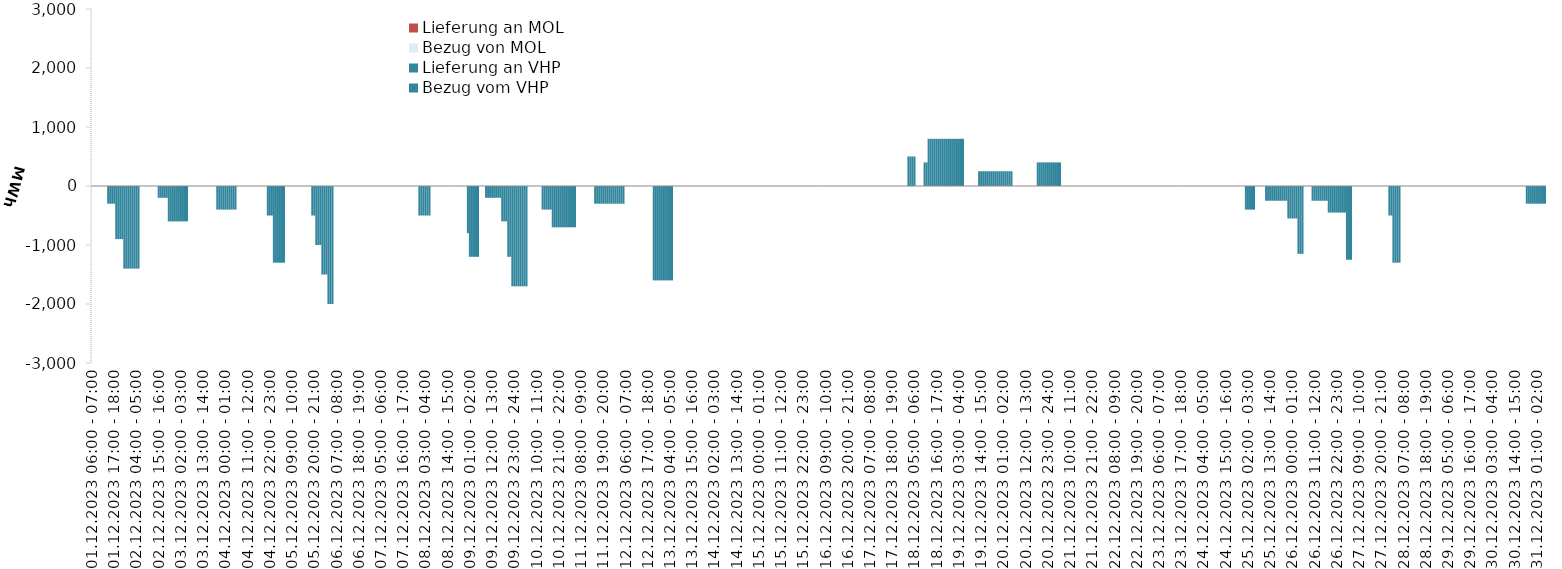
| Category | Bezug vom VHP | Lieferung an VHP | Bezug von MOL | Lieferung an MOL |
|---|---|---|---|---|
| 01.12.2023 06:00 - 07:00 | 0 | 0 | 0 | 0 |
| 01.12.2023 07:00 - 08:00 | 0 | 0 | 0 | 0 |
| 01.12.2023 08:00 - 09:00 | 0 | 0 | 0 | 0 |
| 01.12.2023 09:00 - 10:00 | 0 | 0 | 0 | 0 |
| 01.12.2023 10:00 - 11:00 | 0 | 0 | 0 | 0 |
| 01.12.2023 11:00 - 12:00 | 0 | 0 | 0 | 0 |
| 01.12.2023 12:00 - 13:00 | 0 | 0 | 0 | 0 |
| 01.12.2023 13:00 - 14:00 | 0 | 0 | 0 | 0 |
| 01.12.2023 14:00 - 15:00 | 0 | -300 | 0 | 0 |
| 01.12.2023 15:00 - 16:00 | 0 | -300 | 0 | 0 |
| 01.12.2023 16:00 - 17:00 | 0 | -300 | 0 | 0 |
| 01.12.2023 17:00 - 18:00 | 0 | -300 | 0 | 0 |
| 01.12.2023 18:00 - 19:00 | 0 | -900 | 0 | 0 |
| 01.12.2023 19:00 - 20:00 | 0 | -900 | 0 | 0 |
| 01.12.2023 20:00 - 21:00 | 0 | -900 | 0 | 0 |
| 01.12.2023 21:00 - 22:00 | 0 | -900 | 0 | 0 |
| 01.12.2023 22:00 - 23:00 | 0 | -1400 | 0 | 0 |
| 01.12.2023 23:00 - 24:00 | 0 | -1400 | 0 | 0 |
| 02.12.2023 00:00 - 01:00 | 0 | -1400 | 0 | 0 |
| 02.12.2023 01:00 - 02:00 | 0 | -1400 | 0 | 0 |
| 02.12.2023 02:00 - 03:00 | 0 | -1400 | 0 | 0 |
| 02.12.2023 03:00 - 04:00 | 0 | -1400 | 0 | 0 |
| 02.12.2023 04:00 - 05:00 | 0 | -1400 | 0 | 0 |
| 02.12.2023 05:00 - 06:00 | 0 | -1400 | 0 | 0 |
| 02.12.2023 06:00 - 07:00 | 0 | 0 | 0 | 0 |
| 02.12.2023 07:00 - 08:00 | 0 | 0 | 0 | 0 |
| 02.12.2023 08:00 - 09:00 | 0 | 0 | 0 | 0 |
| 02.12.2023 09:00 - 10:00 | 0 | 0 | 0 | 0 |
| 02.12.2023 10:00 - 11:00 | 0 | 0 | 0 | 0 |
| 02.12.2023 11:00 - 12:00 | 0 | 0 | 0 | 0 |
| 02.12.2023 12:00 - 13:00 | 0 | 0 | 0 | 0 |
| 02.12.2023 13:00 - 14:00 | 0 | 0 | 0 | 0 |
| 02.12.2023 14:00 - 15:00 | 0 | 0 | 0 | 0 |
| 02.12.2023 15:00 - 16:00 | 0 | -200 | 0 | 0 |
| 02.12.2023 16:00 - 17:00 | 0 | -200 | 0 | 0 |
| 02.12.2023 17:00 - 18:00 | 0 | -200 | 0 | 0 |
| 02.12.2023 18:00 - 19:00 | 0 | -200 | 0 | 0 |
| 02.12.2023 19:00 - 20:00 | 0 | -200 | 0 | 0 |
| 02.12.2023 20:00 - 21:00 | 0 | -600 | 0 | 0 |
| 02.12.2023 21:00 - 22:00 | 0 | -600 | 0 | 0 |
| 02.12.2023 22:00 - 23:00 | 0 | -600 | 0 | 0 |
| 02.12.2023 23:00 - 24:00 | 0 | -600 | 0 | 0 |
| 03.12.2023 00:00 - 01:00 | 0 | -600 | 0 | 0 |
| 03.12.2023 01:00 - 02:00 | 0 | -600 | 0 | 0 |
| 03.12.2023 02:00 - 03:00 | 0 | -600 | 0 | 0 |
| 03.12.2023 03:00 - 04:00 | 0 | -600 | 0 | 0 |
| 03.12.2023 04:00 - 05:00 | 0 | -600 | 0 | 0 |
| 03.12.2023 05:00 - 06:00 | 0 | -600 | 0 | 0 |
| 03.12.2023 06:00 - 07:00 | 0 | 0 | 0 | 0 |
| 03.12.2023 07:00 - 08:00 | 0 | 0 | 0 | 0 |
| 03.12.2023 08:00 - 09:00 | 0 | 0 | 0 | 0 |
| 03.12.2023 09:00 - 10:00 | 0 | 0 | 0 | 0 |
| 03.12.2023 10:00 - 11:00 | 0 | 0 | 0 | 0 |
| 03.12.2023 11:00 - 12:00 | 0 | 0 | 0 | 0 |
| 03.12.2023 12:00 - 13:00 | 0 | 0 | 0 | 0 |
| 03.12.2023 13:00 - 14:00 | 0 | 0 | 0 | 0 |
| 03.12.2023 14:00 - 15:00 | 0 | 0 | 0 | 0 |
| 03.12.2023 15:00 - 16:00 | 0 | 0 | 0 | 0 |
| 03.12.2023 16:00 - 17:00 | 0 | 0 | 0 | 0 |
| 03.12.2023 17:00 - 18:00 | 0 | 0 | 0 | 0 |
| 03.12.2023 18:00 - 19:00 | 0 | 0 | 0 | 0 |
| 03.12.2023 19:00 - 20:00 | 0 | 0 | 0 | 0 |
| 03.12.2023 20:00 - 21:00 | 0 | -400 | 0 | 0 |
| 03.12.2023 21:00 - 22:00 | 0 | -400 | 0 | 0 |
| 03.12.2023 22:00 - 23:00 | 0 | -400 | 0 | 0 |
| 03.12.2023 23:00 - 24:00 | 0 | -400 | 0 | 0 |
| 04.12.2023 00:00 - 01:00 | 0 | -400 | 0 | 0 |
| 04.12.2023 01:00 - 02:00 | 0 | -400 | 0 | 0 |
| 04.12.2023 02:00 - 03:00 | 0 | -400 | 0 | 0 |
| 04.12.2023 03:00 - 04:00 | 0 | -400 | 0 | 0 |
| 04.12.2023 04:00 - 05:00 | 0 | -400 | 0 | 0 |
| 04.12.2023 05:00 - 06:00 | 0 | -400 | 0 | 0 |
| 04.12.2023 06:00 - 07:00 | 0 | 0 | 0 | 0 |
| 04.12.2023 07:00 - 08:00 | 0 | 0 | 0 | 0 |
| 04.12.2023 08:00 - 09:00 | 0 | 0 | 0 | 0 |
| 04.12.2023 09:00 - 10:00 | 0 | 0 | 0 | 0 |
| 04.12.2023 10:00 - 11:00 | 0 | 0 | 0 | 0 |
| 04.12.2023 11:00 - 12:00 | 0 | 0 | 0 | 0 |
| 04.12.2023 12:00 - 13:00 | 0 | 0 | 0 | 0 |
| 04.12.2023 13:00 - 14:00 | 0 | 0 | 0 | 0 |
| 04.12.2023 14:00 - 15:00 | 0 | 0 | 0 | 0 |
| 04.12.2023 15:00 - 16:00 | 0 | 0 | 0 | 0 |
| 04.12.2023 16:00 - 17:00 | 0 | 0 | 0 | 0 |
| 04.12.2023 17:00 - 18:00 | 0 | 0 | 0 | 0 |
| 04.12.2023 18:00 - 19:00 | 0 | 0 | 0 | 0 |
| 04.12.2023 19:00 - 20:00 | 0 | 0 | 0 | 0 |
| 04.12.2023 20:00 - 21:00 | 0 | 0 | 0 | 0 |
| 04.12.2023 21:00 - 22:00 | 0 | -500 | 0 | 0 |
| 04.12.2023 22:00 - 23:00 | 0 | -500 | 0 | 0 |
| 04.12.2023 23:00 - 24:00 | 0 | -500 | 0 | 0 |
| 05.12.2023 00:00 - 01:00 | 0 | -1300 | 0 | 0 |
| 05.12.2023 01:00 - 02:00 | 0 | -1300 | 0 | 0 |
| 05.12.2023 02:00 - 03:00 | 0 | -1300 | 0 | 0 |
| 05.12.2023 03:00 - 04:00 | 0 | -1300 | 0 | 0 |
| 05.12.2023 04:00 - 05:00 | 0 | -1300 | 0 | 0 |
| 05.12.2023 05:00 - 06:00 | 0 | -1300 | 0 | 0 |
| 05.12.2023 06:00 - 07:00 | 0 | 0 | 0 | 0 |
| 05.12.2023 07:00 - 08:00 | 0 | 0 | 0 | 0 |
| 05.12.2023 08:00 - 09:00 | 0 | 0 | 0 | 0 |
| 05.12.2023 09:00 - 10:00 | 0 | 0 | 0 | 0 |
| 05.12.2023 10:00 - 11:00 | 0 | 0 | 0 | 0 |
| 05.12.2023 11:00 - 12:00 | 0 | 0 | 0 | 0 |
| 05.12.2023 12:00 - 13:00 | 0 | 0 | 0 | 0 |
| 05.12.2023 13:00 - 14:00 | 0 | 0 | 0 | 0 |
| 05.12.2023 14:00 - 15:00 | 0 | 0 | 0 | 0 |
| 05.12.2023 15:00 - 16:00 | 0 | 0 | 0 | 0 |
| 05.12.2023 16:00 - 17:00 | 0 | 0 | 0 | 0 |
| 05.12.2023 17:00 - 18:00 | 0 | 0 | 0 | 0 |
| 05.12.2023 18:00 - 19:00 | 0 | 0 | 0 | 0 |
| 05.12.2023 19:00 - 20:00 | 0 | -500 | 0 | 0 |
| 05.12.2023 20:00 - 21:00 | 0 | -500 | 0 | 0 |
| 05.12.2023 21:00 - 22:00 | 0 | -1000 | 0 | 0 |
| 05.12.2023 22:00 - 23:00 | 0 | -1000 | 0 | 0 |
| 05.12.2023 23:00 - 24:00 | 0 | -1000 | 0 | 0 |
| 06.12.2023 00:00 - 01:00 | 0 | -1500 | 0 | 0 |
| 06.12.2023 01:00 - 02:00 | 0 | -1500 | 0 | 0 |
| 06.12.2023 02:00 - 03:00 | 0 | -1500 | 0 | 0 |
| 06.12.2023 03:00 - 04:00 | 0 | -2000 | 0 | 0 |
| 06.12.2023 04:00 - 05:00 | 0 | -2000 | 0 | 0 |
| 06.12.2023 05:00 - 06:00 | 0 | -2000 | 0 | 0 |
| 06.12.2023 06:00 - 07:00 | 0 | 0 | 0 | 0 |
| 06.12.2023 07:00 - 08:00 | 0 | 0 | 0 | 0 |
| 06.12.2023 08:00 - 09:00 | 0 | 0 | 0 | 0 |
| 06.12.2023 09:00 - 10:00 | 0 | 0 | 0 | 0 |
| 06.12.2023 10:00 - 11:00 | 0 | 0 | 0 | 0 |
| 06.12.2023 11:00 - 12:00 | 0 | 0 | 0 | 0 |
| 06.12.2023 12:00 - 13:00 | 0 | 0 | 0 | 0 |
| 06.12.2023 13:00 - 14:00 | 0 | 0 | 0 | 0 |
| 06.12.2023 14:00 - 15:00 | 0 | 0 | 0 | 0 |
| 06.12.2023 15:00 - 16:00 | 0 | 0 | 0 | 0 |
| 06.12.2023 16:00 - 17:00 | 0 | 0 | 0 | 0 |
| 06.12.2023 17:00 - 18:00 | 0 | 0 | 0 | 0 |
| 06.12.2023 18:00 - 19:00 | 0 | 0 | 0 | 0 |
| 06.12.2023 19:00 - 20:00 | 0 | 0 | 0 | 0 |
| 06.12.2023 20:00 - 21:00 | 0 | 0 | 0 | 0 |
| 06.12.2023 21:00 - 22:00 | 0 | 0 | 0 | 0 |
| 06.12.2023 22:00 - 23:00 | 0 | 0 | 0 | 0 |
| 06.12.2023 23:00 - 24:00 | 0 | 0 | 0 | 0 |
| 07.12.2023 00:00 - 01:00 | 0 | 0 | 0 | 0 |
| 07.12.2023 01:00 - 02:00 | 0 | 0 | 0 | 0 |
| 07.12.2023 02:00 - 03:00 | 0 | 0 | 0 | 0 |
| 07.12.2023 03:00 - 04:00 | 0 | 0 | 0 | 0 |
| 07.12.2023 04:00 - 05:00 | 0 | 0 | 0 | 0 |
| 07.12.2023 05:00 - 06:00 | 0 | 0 | 0 | 0 |
| 07.12.2023 06:00 - 07:00 | 0 | 0 | 0 | 0 |
| 07.12.2023 07:00 - 08:00 | 0 | 0 | 0 | 0 |
| 07.12.2023 08:00 - 09:00 | 0 | 0 | 0 | 0 |
| 07.12.2023 09:00 - 10:00 | 0 | 0 | 0 | 0 |
| 07.12.2023 10:00 - 11:00 | 0 | 0 | 0 | 0 |
| 07.12.2023 11:00 - 12:00 | 0 | 0 | 0 | 0 |
| 07.12.2023 12:00 - 13:00 | 0 | 0 | 0 | 0 |
| 07.12.2023 13:00 - 14:00 | 0 | 0 | 0 | 0 |
| 07.12.2023 14:00 - 15:00 | 0 | 0 | 0 | 0 |
| 07.12.2023 15:00 - 16:00 | 0 | 0 | 0 | 0 |
| 07.12.2023 16:00 - 17:00 | 0 | 0 | 0 | 0 |
| 07.12.2023 17:00 - 18:00 | 0 | 0 | 0 | 0 |
| 07.12.2023 18:00 - 19:00 | 0 | 0 | 0 | 0 |
| 07.12.2023 19:00 - 20:00 | 0 | 0 | 0 | 0 |
| 07.12.2023 20:00 - 21:00 | 0 | 0 | 0 | 0 |
| 07.12.2023 21:00 - 22:00 | 0 | 0 | 0 | 0 |
| 07.12.2023 22:00 - 23:00 | 0 | 0 | 0 | 0 |
| 07.12.2023 23:00 - 24:00 | 0 | 0 | 0 | 0 |
| 08.12.2023 00:00 - 01:00 | 0 | -500 | 0 | 0 |
| 08.12.2023 01:00 - 02:00 | 0 | -500 | 0 | 0 |
| 08.12.2023 02:00 - 03:00 | 0 | -500 | 0 | 0 |
| 08.12.2023 03:00 - 04:00 | 0 | -500 | 0 | 0 |
| 08.12.2023 04:00 - 05:00 | 0 | -500 | 0 | 0 |
| 08.12.2023 05:00 - 06:00 | 0 | -500 | 0 | 0 |
| 08.12.2023 06:00 - 07:00 | 0 | 0 | 0 | 0 |
| 08.12.2023 07:00 - 08:00 | 0 | 0 | 0 | 0 |
| 08.12.2023 08:00 - 09:00 | 0 | 0 | 0 | 0 |
| 08.12.2023 09:00 - 10:00 | 0 | 0 | 0 | 0 |
| 08.12.2023 10:00 - 11:00 | 0 | 0 | 0 | 0 |
| 08.12.2023 11:00 - 12:00 | 0 | 0 | 0 | 0 |
| 08.12.2023 12:00 - 13:00 | 0 | 0 | 0 | 0 |
| 08.12.2023 13:00 - 14:00 | 0 | 0 | 0 | 0 |
| 08.12.2023 14:00 - 15:00 | 0 | 0 | 0 | 0 |
| 08.12.2023 15:00 - 16:00 | 0 | 0 | 0 | 0 |
| 08.12.2023 16:00 - 17:00 | 0 | 0 | 0 | 0 |
| 08.12.2023 17:00 - 18:00 | 0 | 0 | 0 | 0 |
| 08.12.2023 18:00 - 19:00 | 0 | 0 | 0 | 0 |
| 08.12.2023 19:00 - 20:00 | 0 | 0 | 0 | 0 |
| 08.12.2023 20:00 - 21:00 | 0 | 0 | 0 | 0 |
| 08.12.2023 21:00 - 22:00 | 0 | 0 | 0 | 0 |
| 08.12.2023 22:00 - 23:00 | 0 | 0 | 0 | 0 |
| 08.12.2023 23:00 - 24:00 | 0 | 0 | 0 | 0 |
| 09.12.2023 00:00 - 01:00 | 0 | -800 | 0 | 0 |
| 09.12.2023 01:00 - 02:00 | 0 | -1200 | 0 | 0 |
| 09.12.2023 02:00 - 03:00 | 0 | -1200 | 0 | 0 |
| 09.12.2023 03:00 - 04:00 | 0 | -1200 | 0 | 0 |
| 09.12.2023 04:00 - 05:00 | 0 | -1200 | 0 | 0 |
| 09.12.2023 05:00 - 06:00 | 0 | -1200 | 0 | 0 |
| 09.12.2023 06:00 - 07:00 | 0 | 0 | 0 | 0 |
| 09.12.2023 07:00 - 08:00 | 0 | 0 | 0 | 0 |
| 09.12.2023 08:00 - 09:00 | 0 | 0 | 0 | 0 |
| 09.12.2023 09:00 - 10:00 | 0 | -200 | 0 | 0 |
| 09.12.2023 10:00 - 11:00 | 0 | -200 | 0 | 0 |
| 09.12.2023 11:00 - 12:00 | 0 | -200 | 0 | 0 |
| 09.12.2023 12:00 - 13:00 | 0 | -200 | 0 | 0 |
| 09.12.2023 13:00 - 14:00 | 0 | -200 | 0 | 0 |
| 09.12.2023 14:00 - 15:00 | 0 | -200 | 0 | 0 |
| 09.12.2023 15:00 - 16:00 | 0 | -200 | 0 | 0 |
| 09.12.2023 16:00 - 17:00 | 0 | -200 | 0 | 0 |
| 09.12.2023 17:00 - 18:00 | 0 | -600 | 0 | 0 |
| 09.12.2023 18:00 - 19:00 | 0 | -600 | 0 | 0 |
| 09.12.2023 19:00 - 20:00 | 0 | -600 | 0 | 0 |
| 09.12.2023 20:00 - 21:00 | 0 | -1200 | 0 | 0 |
| 09.12.2023 21:00 - 22:00 | 0 | -1200 | 0 | 0 |
| 09.12.2023 22:00 - 23:00 | 0 | -1700 | 0 | 0 |
| 09.12.2023 23:00 - 24:00 | 0 | -1700 | 0 | 0 |
| 10.12.2023 00:00 - 01:00 | 0 | -1700 | 0 | 0 |
| 10.12.2023 01:00 - 02:00 | 0 | -1700 | 0 | 0 |
| 10.12.2023 02:00 - 03:00 | 0 | -1700 | 0 | 0 |
| 10.12.2023 03:00 - 04:00 | 0 | -1700 | 0 | 0 |
| 10.12.2023 04:00 - 05:00 | 0 | -1700 | 0 | 0 |
| 10.12.2023 05:00 - 06:00 | 0 | -1700 | 0 | 0 |
| 10.12.2023 06:00 - 07:00 | 0 | 0 | 0 | 0 |
| 10.12.2023 07:00 - 08:00 | 0 | 0 | 0 | 0 |
| 10.12.2023 08:00 - 09:00 | 0 | 0 | 0 | 0 |
| 10.12.2023 09:00 - 10:00 | 0 | 0 | 0 | 0 |
| 10.12.2023 10:00 - 11:00 | 0 | 0 | 0 | 0 |
| 10.12.2023 11:00 - 12:00 | 0 | 0 | 0 | 0 |
| 10.12.2023 12:00 - 13:00 | 0 | 0 | 0 | 0 |
| 10.12.2023 13:00 - 14:00 | 0 | -400 | 0 | 0 |
| 10.12.2023 14:00 - 15:00 | 0 | -400 | 0 | 0 |
| 10.12.2023 15:00 - 16:00 | 0 | -400 | 0 | 0 |
| 10.12.2023 16:00 - 17:00 | 0 | -400 | 0 | 0 |
| 10.12.2023 17:00 - 18:00 | 0 | -400 | 0 | 0 |
| 10.12.2023 18:00 - 19:00 | 0 | -700 | 0 | 0 |
| 10.12.2023 19:00 - 20:00 | 0 | -700 | 0 | 0 |
| 10.12.2023 20:00 - 21:00 | 0 | -700 | 0 | 0 |
| 10.12.2023 21:00 - 22:00 | 0 | -700 | 0 | 0 |
| 10.12.2023 22:00 - 23:00 | 0 | -700 | 0 | 0 |
| 10.12.2023 23:00 - 24:00 | 0 | -700 | 0 | 0 |
| 11.12.2023 00:00 - 01:00 | 0 | -700 | 0 | 0 |
| 11.12.2023 01:00 - 02:00 | 0 | -700 | 0 | 0 |
| 11.12.2023 02:00 - 03:00 | 0 | -700 | 0 | 0 |
| 11.12.2023 03:00 - 04:00 | 0 | -700 | 0 | 0 |
| 11.12.2023 04:00 - 05:00 | 0 | -700 | 0 | 0 |
| 11.12.2023 05:00 - 06:00 | 0 | -700 | 0 | 0 |
| 11.12.2023 06:00 - 07:00 | 0 | 0 | 0 | 0 |
| 11.12.2023 07:00 - 08:00 | 0 | 0 | 0 | 0 |
| 11.12.2023 08:00 - 09:00 | 0 | 0 | 0 | 0 |
| 11.12.2023 09:00 - 10:00 | 0 | 0 | 0 | 0 |
| 11.12.2023 10:00 - 11:00 | 0 | 0 | 0 | 0 |
| 11.12.2023 11:00 - 12:00 | 0 | 0 | 0 | 0 |
| 11.12.2023 12:00 - 13:00 | 0 | 0 | 0 | 0 |
| 11.12.2023 13:00 - 14:00 | 0 | 0 | 0 | 0 |
| 11.12.2023 14:00 - 15:00 | 0 | 0 | 0 | 0 |
| 11.12.2023 15:00 - 16:00 | 0 | -300 | 0 | 0 |
| 11.12.2023 16:00 - 17:00 | 0 | -300 | 0 | 0 |
| 11.12.2023 17:00 - 18:00 | 0 | -300 | 0 | 0 |
| 11.12.2023 18:00 - 19:00 | 0 | -300 | 0 | 0 |
| 11.12.2023 19:00 - 20:00 | 0 | -300 | 0 | 0 |
| 11.12.2023 20:00 - 21:00 | 0 | -300 | 0 | 0 |
| 11.12.2023 21:00 - 22:00 | 0 | -300 | 0 | 0 |
| 11.12.2023 22:00 - 23:00 | 0 | -300 | 0 | 0 |
| 11.12.2023 23:00 - 24:00 | 0 | -300 | 0 | 0 |
| 12.12.2023 00:00 - 01:00 | 0 | -300 | 0 | 0 |
| 12.12.2023 01:00 - 02:00 | 0 | -300 | 0 | 0 |
| 12.12.2023 02:00 - 03:00 | 0 | -300 | 0 | 0 |
| 12.12.2023 03:00 - 04:00 | 0 | -300 | 0 | 0 |
| 12.12.2023 04:00 - 05:00 | 0 | -300 | 0 | 0 |
| 12.12.2023 05:00 - 06:00 | 0 | -300 | 0 | 0 |
| 12.12.2023 06:00 - 07:00 | 0 | 0 | 0 | 0 |
| 12.12.2023 07:00 - 08:00 | 0 | 0 | 0 | 0 |
| 12.12.2023 08:00 - 09:00 | 0 | 0 | 0 | 0 |
| 12.12.2023 09:00 - 10:00 | 0 | 0 | 0 | 0 |
| 12.12.2023 10:00 - 11:00 | 0 | 0 | 0 | 0 |
| 12.12.2023 11:00 - 12:00 | 0 | 0 | 0 | 0 |
| 12.12.2023 12:00 - 13:00 | 0 | 0 | 0 | 0 |
| 12.12.2023 13:00 - 14:00 | 0 | 0 | 0 | 0 |
| 12.12.2023 14:00 - 15:00 | 0 | 0 | 0 | 0 |
| 12.12.2023 15:00 - 16:00 | 0 | 0 | 0 | 0 |
| 12.12.2023 16:00 - 17:00 | 0 | 0 | 0 | 0 |
| 12.12.2023 17:00 - 18:00 | 0 | 0 | 0 | 0 |
| 12.12.2023 18:00 - 19:00 | 0 | 0 | 0 | 0 |
| 12.12.2023 19:00 - 20:00 | 0 | 0 | 0 | 0 |
| 12.12.2023 20:00 - 21:00 | 0 | -1600 | 0 | 0 |
| 12.12.2023 21:00 - 22:00 | 0 | -1600 | 0 | 0 |
| 12.12.2023 22:00 - 23:00 | 0 | -1600 | 0 | 0 |
| 12.12.2023 23:00 - 24:00 | 0 | -1600 | 0 | 0 |
| 13.12.2023 00:00 - 01:00 | 0 | -1600 | 0 | 0 |
| 13.12.2023 01:00 - 02:00 | 0 | -1600 | 0 | 0 |
| 13.12.2023 02:00 - 03:00 | 0 | -1600 | 0 | 0 |
| 13.12.2023 03:00 - 04:00 | 0 | -1600 | 0 | 0 |
| 13.12.2023 04:00 - 05:00 | 0 | -1600 | 0 | 0 |
| 13.12.2023 05:00 - 06:00 | 0 | -1600 | 0 | 0 |
| 13.12.2023 06:00 - 07:00 | 0 | 0 | 0 | 0 |
| 13.12.2023 07:00 - 08:00 | 0 | 0 | 0 | 0 |
| 13.12.2023 08:00 - 09:00 | 0 | 0 | 0 | 0 |
| 13.12.2023 09:00 - 10:00 | 0 | 0 | 0 | 0 |
| 13.12.2023 10:00 - 11:00 | 0 | 0 | 0 | 0 |
| 13.12.2023 11:00 - 12:00 | 0 | 0 | 0 | 0 |
| 13.12.2023 12:00 - 13:00 | 0 | 0 | 0 | 0 |
| 13.12.2023 13:00 - 14:00 | 0 | 0 | 0 | 0 |
| 13.12.2023 14:00 - 15:00 | 0 | 0 | 0 | 0 |
| 13.12.2023 15:00 - 16:00 | 0 | 0 | 0 | 0 |
| 13.12.2023 16:00 - 17:00 | 0 | 0 | 0 | 0 |
| 13.12.2023 17:00 - 18:00 | 0 | 0 | 0 | 0 |
| 13.12.2023 18:00 - 19:00 | 0 | 0 | 0 | 0 |
| 13.12.2023 19:00 - 20:00 | 0 | 0 | 0 | 0 |
| 13.12.2023 20:00 - 21:00 | 0 | 0 | 0 | 0 |
| 13.12.2023 21:00 - 22:00 | 0 | 0 | 0 | 0 |
| 13.12.2023 22:00 - 23:00 | 0 | 0 | 0 | 0 |
| 13.12.2023 23:00 - 24:00 | 0 | 0 | 0 | 0 |
| 14.12.2023 00:00 - 01:00 | 0 | 0 | 0 | 0 |
| 14.12.2023 01:00 - 02:00 | 0 | 0 | 0 | 0 |
| 14.12.2023 02:00 - 03:00 | 0 | 0 | 0 | 0 |
| 14.12.2023 03:00 - 04:00 | 0 | 0 | 0 | 0 |
| 14.12.2023 04:00 - 05:00 | 0 | 0 | 0 | 0 |
| 14.12.2023 05:00 - 06:00 | 0 | 0 | 0 | 0 |
| 14.12.2023 06:00 - 07:00 | 0 | 0 | 0 | 0 |
| 14.12.2023 07:00 - 08:00 | 0 | 0 | 0 | 0 |
| 14.12.2023 08:00 - 09:00 | 0 | 0 | 0 | 0 |
| 14.12.2023 09:00 - 10:00 | 0 | 0 | 0 | 0 |
| 14.12.2023 10:00 - 11:00 | 0 | 0 | 0 | 0 |
| 14.12.2023 11:00 - 12:00 | 0 | 0 | 0 | 0 |
| 14.12.2023 12:00 - 13:00 | 0 | 0 | 0 | 0 |
| 14.12.2023 13:00 - 14:00 | 0 | 0 | 0 | 0 |
| 14.12.2023 14:00 - 15:00 | 0 | 0 | 0 | 0 |
| 14.12.2023 15:00 - 16:00 | 0 | 0 | 0 | 0 |
| 14.12.2023 16:00 - 17:00 | 0 | 0 | 0 | 0 |
| 14.12.2023 17:00 - 18:00 | 0 | 0 | 0 | 0 |
| 14.12.2023 18:00 - 19:00 | 0 | 0 | 0 | 0 |
| 14.12.2023 19:00 - 20:00 | 0 | 0 | 0 | 0 |
| 14.12.2023 20:00 - 21:00 | 0 | 0 | 0 | 0 |
| 14.12.2023 21:00 - 22:00 | 0 | 0 | 0 | 0 |
| 14.12.2023 22:00 - 23:00 | 0 | 0 | 0 | 0 |
| 14.12.2023 23:00 - 24:00 | 0 | 0 | 0 | 0 |
| 15.12.2023 00:00 - 01:00 | 0 | 0 | 0 | 0 |
| 15.12.2023 01:00 - 02:00 | 0 | 0 | 0 | 0 |
| 15.12.2023 02:00 - 03:00 | 0 | 0 | 0 | 0 |
| 15.12.2023 03:00 - 04:00 | 0 | 0 | 0 | 0 |
| 15.12.2023 04:00 - 05:00 | 0 | 0 | 0 | 0 |
| 15.12.2023 05:00 - 06:00 | 0 | 0 | 0 | 0 |
| 15.12.2023 06:00 - 07:00 | 0 | 0 | 0 | 0 |
| 15.12.2023 07:00 - 08:00 | 0 | 0 | 0 | 0 |
| 15.12.2023 08:00 - 09:00 | 0 | 0 | 0 | 0 |
| 15.12.2023 09:00 - 10:00 | 0 | 0 | 0 | 0 |
| 15.12.2023 10:00 - 11:00 | 0 | 0 | 0 | 0 |
| 15.12.2023 11:00 - 12:00 | 0 | 0 | 0 | 0 |
| 15.12.2023 12:00 - 13:00 | 0 | 0 | 0 | 0 |
| 15.12.2023 13:00 - 14:00 | 0 | 0 | 0 | 0 |
| 15.12.2023 14:00 - 15:00 | 0 | 0 | 0 | 0 |
| 15.12.2023 15:00 - 16:00 | 0 | 0 | 0 | 0 |
| 15.12.2023 16:00 - 17:00 | 0 | 0 | 0 | 0 |
| 15.12.2023 17:00 - 18:00 | 0 | 0 | 0 | 0 |
| 15.12.2023 18:00 - 19:00 | 0 | 0 | 0 | 0 |
| 15.12.2023 19:00 - 20:00 | 0 | 0 | 0 | 0 |
| 15.12.2023 20:00 - 21:00 | 0 | 0 | 0 | 0 |
| 15.12.2023 21:00 - 22:00 | 0 | 0 | 0 | 0 |
| 15.12.2023 22:00 - 23:00 | 0 | 0 | 0 | 0 |
| 15.12.2023 23:00 - 24:00 | 0 | 0 | 0 | 0 |
| 16.12.2023 00:00 - 01:00 | 0 | 0 | 0 | 0 |
| 16.12.2023 01:00 - 02:00 | 0 | 0 | 0 | 0 |
| 16.12.2023 02:00 - 03:00 | 0 | 0 | 0 | 0 |
| 16.12.2023 03:00 - 04:00 | 0 | 0 | 0 | 0 |
| 16.12.2023 04:00 - 05:00 | 0 | 0 | 0 | 0 |
| 16.12.2023 05:00 - 06:00 | 0 | 0 | 0 | 0 |
| 16.12.2023 06:00 - 07:00 | 0 | 0 | 0 | 0 |
| 16.12.2023 07:00 - 08:00 | 0 | 0 | 0 | 0 |
| 16.12.2023 08:00 - 09:00 | 0 | 0 | 0 | 0 |
| 16.12.2023 09:00 - 10:00 | 0 | 0 | 0 | 0 |
| 16.12.2023 10:00 - 11:00 | 0 | 0 | 0 | 0 |
| 16.12.2023 11:00 - 12:00 | 0 | 0 | 0 | 0 |
| 16.12.2023 12:00 - 13:00 | 0 | 0 | 0 | 0 |
| 16.12.2023 13:00 - 14:00 | 0 | 0 | 0 | 0 |
| 16.12.2023 14:00 - 15:00 | 0 | 0 | 0 | 0 |
| 16.12.2023 15:00 - 16:00 | 0 | 0 | 0 | 0 |
| 16.12.2023 16:00 - 17:00 | 0 | 0 | 0 | 0 |
| 16.12.2023 17:00 - 18:00 | 0 | 0 | 0 | 0 |
| 16.12.2023 18:00 - 19:00 | 0 | 0 | 0 | 0 |
| 16.12.2023 19:00 - 20:00 | 0 | 0 | 0 | 0 |
| 16.12.2023 20:00 - 21:00 | 0 | 0 | 0 | 0 |
| 16.12.2023 21:00 - 22:00 | 0 | 0 | 0 | 0 |
| 16.12.2023 22:00 - 23:00 | 0 | 0 | 0 | 0 |
| 16.12.2023 23:00 - 24:00 | 0 | 0 | 0 | 0 |
| 17.12.2023 00:00 - 01:00 | 0 | 0 | 0 | 0 |
| 17.12.2023 01:00 - 02:00 | 0 | 0 | 0 | 0 |
| 17.12.2023 02:00 - 03:00 | 0 | 0 | 0 | 0 |
| 17.12.2023 03:00 - 04:00 | 0 | 0 | 0 | 0 |
| 17.12.2023 04:00 - 05:00 | 0 | 0 | 0 | 0 |
| 17.12.2023 05:00 - 06:00 | 0 | 0 | 0 | 0 |
| 17.12.2023 06:00 - 07:00 | 0 | 0 | 0 | 0 |
| 17.12.2023 07:00 - 08:00 | 0 | 0 | 0 | 0 |
| 17.12.2023 08:00 - 09:00 | 0 | 0 | 0 | 0 |
| 17.12.2023 09:00 - 10:00 | 0 | 0 | 0 | 0 |
| 17.12.2023 10:00 - 11:00 | 0 | 0 | 0 | 0 |
| 17.12.2023 11:00 - 12:00 | 0 | 0 | 0 | 0 |
| 17.12.2023 12:00 - 13:00 | 0 | 0 | 0 | 0 |
| 17.12.2023 13:00 - 14:00 | 0 | 0 | 0 | 0 |
| 17.12.2023 14:00 - 15:00 | 0 | 0 | 0 | 0 |
| 17.12.2023 15:00 - 16:00 | 0 | 0 | 0 | 0 |
| 17.12.2023 16:00 - 17:00 | 0 | 0 | 0 | 0 |
| 17.12.2023 17:00 - 18:00 | 0 | 0 | 0 | 0 |
| 17.12.2023 18:00 - 19:00 | 0 | 0 | 0 | 0 |
| 17.12.2023 19:00 - 20:00 | 0 | 0 | 0 | 0 |
| 17.12.2023 20:00 - 21:00 | 0 | 0 | 0 | 0 |
| 17.12.2023 21:00 - 22:00 | 0 | 0 | 0 | 0 |
| 17.12.2023 22:00 - 23:00 | 0 | 0 | 0 | 0 |
| 17.12.2023 23:00 - 24:00 | 0 | 0 | 0 | 0 |
| 18.12.2023 00:00 - 01:00 | 0 | 0 | 0 | 0 |
| 18.12.2023 01:00 - 02:00 | 0 | 0 | 0 | 0 |
| 18.12.2023 02:00 - 03:00 | 500 | 0 | 0 | 0 |
| 18.12.2023 03:00 - 04:00 | 500 | 0 | 0 | 0 |
| 18.12.2023 04:00 - 05:00 | 500 | 0 | 0 | 0 |
| 18.12.2023 05:00 - 06:00 | 500 | 0 | 0 | 0 |
| 18.12.2023 06:00 - 07:00 | 0 | 0 | 0 | 0 |
| 18.12.2023 07:00 - 08:00 | 0 | 0 | 0 | 0 |
| 18.12.2023 08:00 - 09:00 | 0 | 0 | 0 | 0 |
| 18.12.2023 09:00 - 10:00 | 0 | 0 | 0 | 0 |
| 18.12.2023 10:00 - 11:00 | 400 | 0 | 0 | 0 |
| 18.12.2023 11:00 - 12:00 | 400 | 0 | 0 | 0 |
| 18.12.2023 12:00 - 13:00 | 800 | 0 | 0 | 0 |
| 18.12.2023 13:00 - 14:00 | 800 | 0 | 0 | 0 |
| 18.12.2023 14:00 - 15:00 | 800 | 0 | 0 | 0 |
| 18.12.2023 15:00 - 16:00 | 800 | 0 | 0 | 0 |
| 18.12.2023 16:00 - 17:00 | 800 | 0 | 0 | 0 |
| 18.12.2023 17:00 - 18:00 | 800 | 0 | 0 | 0 |
| 18.12.2023 18:00 - 19:00 | 800 | 0 | 0 | 0 |
| 18.12.2023 19:00 - 20:00 | 800 | 0 | 0 | 0 |
| 18.12.2023 20:00 - 21:00 | 800 | 0 | 0 | 0 |
| 18.12.2023 21:00 - 22:00 | 800 | 0 | 0 | 0 |
| 18.12.2023 22:00 - 23:00 | 800 | 0 | 0 | 0 |
| 18.12.2023 23:00 - 24:00 | 800 | 0 | 0 | 0 |
| 19.12.2023 00:00 - 01:00 | 800 | 0 | 0 | 0 |
| 19.12.2023 01:00 - 02:00 | 800 | 0 | 0 | 0 |
| 19.12.2023 02:00 - 03:00 | 800 | 0 | 0 | 0 |
| 19.12.2023 03:00 - 04:00 | 800 | 0 | 0 | 0 |
| 19.12.2023 04:00 - 05:00 | 800 | 0 | 0 | 0 |
| 19.12.2023 05:00 - 06:00 | 800 | 0 | 0 | 0 |
| 19.12.2023 06:00 - 07:00 | 0 | 0 | 0 | 0 |
| 19.12.2023 07:00 - 08:00 | 0 | 0 | 0 | 0 |
| 19.12.2023 08:00 - 09:00 | 0 | 0 | 0 | 0 |
| 19.12.2023 09:00 - 10:00 | 0 | 0 | 0 | 0 |
| 19.12.2023 10:00 - 11:00 | 0 | 0 | 0 | 0 |
| 19.12.2023 11:00 - 12:00 | 0 | 0 | 0 | 0 |
| 19.12.2023 12:00 - 13:00 | 0 | 0 | 0 | 0 |
| 19.12.2023 13:00 - 14:00 | 250 | 0 | 0 | 0 |
| 19.12.2023 14:00 - 15:00 | 250 | 0 | 0 | 0 |
| 19.12.2023 15:00 - 16:00 | 250 | 0 | 0 | 0 |
| 19.12.2023 16:00 - 17:00 | 250 | 0 | 0 | 0 |
| 19.12.2023 17:00 - 18:00 | 250 | 0 | 0 | 0 |
| 19.12.2023 18:00 - 19:00 | 250 | 0 | 0 | 0 |
| 19.12.2023 19:00 - 20:00 | 250 | 0 | 0 | 0 |
| 19.12.2023 20:00 - 21:00 | 250 | 0 | 0 | 0 |
| 19.12.2023 21:00 - 22:00 | 250 | 0 | 0 | 0 |
| 19.12.2023 22:00 - 23:00 | 250 | 0 | 0 | 0 |
| 19.12.2023 23:00 - 24:00 | 250 | 0 | 0 | 0 |
| 20.12.2023 00:00 - 01:00 | 250 | 0 | 0 | 0 |
| 20.12.2023 01:00 - 02:00 | 250 | 0 | 0 | 0 |
| 20.12.2023 02:00 - 03:00 | 250 | 0 | 0 | 0 |
| 20.12.2023 03:00 - 04:00 | 250 | 0 | 0 | 0 |
| 20.12.2023 04:00 - 05:00 | 250 | 0 | 0 | 0 |
| 20.12.2023 05:00 - 06:00 | 250 | 0 | 0 | 0 |
| 20.12.2023 06:00 - 07:00 | 0 | 0 | 0 | 0 |
| 20.12.2023 07:00 - 08:00 | 0 | 0 | 0 | 0 |
| 20.12.2023 08:00 - 09:00 | 0 | 0 | 0 | 0 |
| 20.12.2023 09:00 - 10:00 | 0 | 0 | 0 | 0 |
| 20.12.2023 10:00 - 11:00 | 0 | 0 | 0 | 0 |
| 20.12.2023 11:00 - 12:00 | 0 | 0 | 0 | 0 |
| 20.12.2023 12:00 - 13:00 | 0 | 0 | 0 | 0 |
| 20.12.2023 13:00 - 14:00 | 0 | 0 | 0 | 0 |
| 20.12.2023 14:00 - 15:00 | 0 | 0 | 0 | 0 |
| 20.12.2023 15:00 - 16:00 | 0 | 0 | 0 | 0 |
| 20.12.2023 16:00 - 17:00 | 0 | 0 | 0 | 0 |
| 20.12.2023 17:00 - 18:00 | 0 | 0 | 0 | 0 |
| 20.12.2023 18:00 - 19:00 | 400 | 0 | 0 | 0 |
| 20.12.2023 19:00 - 20:00 | 400 | 0 | 0 | 0 |
| 20.12.2023 20:00 - 21:00 | 400 | 0 | 0 | 0 |
| 20.12.2023 21:00 - 22:00 | 400 | 0 | 0 | 0 |
| 20.12.2023 22:00 - 23:00 | 400 | 0 | 0 | 0 |
| 20.12.2023 23:00 - 24:00 | 400 | 0 | 0 | 0 |
| 21.12.2023 00:00 - 01:00 | 400 | 0 | 0 | 0 |
| 21.12.2023 01:00 - 02:00 | 400 | 0 | 0 | 0 |
| 21.12.2023 02:00 - 03:00 | 400 | 0 | 0 | 0 |
| 21.12.2023 03:00 - 04:00 | 400 | 0 | 0 | 0 |
| 21.12.2023 04:00 - 05:00 | 400 | 0 | 0 | 0 |
| 21.12.2023 05:00 - 06:00 | 400 | 0 | 0 | 0 |
| 21.12.2023 06:00 - 07:00 | 0 | 0 | 0 | 0 |
| 21.12.2023 07:00 - 08:00 | 0 | 0 | 0 | 0 |
| 21.12.2023 08:00 - 09:00 | 0 | 0 | 0 | 0 |
| 21.12.2023 09:00 - 10:00 | 0 | 0 | 0 | 0 |
| 21.12.2023 10:00 - 11:00 | 0 | 0 | 0 | 0 |
| 21.12.2023 11:00 - 12:00 | 0 | 0 | 0 | 0 |
| 21.12.2023 12:00 - 13:00 | 0 | 0 | 0 | 0 |
| 21.12.2023 13:00 - 14:00 | 0 | 0 | 0 | 0 |
| 21.12.2023 14:00 - 15:00 | 0 | 0 | 0 | 0 |
| 21.12.2023 15:00 - 16:00 | 0 | 0 | 0 | 0 |
| 21.12.2023 16:00 - 17:00 | 0 | 0 | 0 | 0 |
| 21.12.2023 17:00 - 18:00 | 0 | 0 | 0 | 0 |
| 21.12.2023 18:00 - 19:00 | 0 | 0 | 0 | 0 |
| 21.12.2023 19:00 - 20:00 | 0 | 0 | 0 | 0 |
| 21.12.2023 20:00 - 21:00 | 0 | 0 | 0 | 0 |
| 21.12.2023 21:00 - 22:00 | 0 | 0 | 0 | 0 |
| 21.12.2023 22:00 - 23:00 | 0 | 0 | 0 | 0 |
| 21.12.2023 23:00 - 24:00 | 0 | 0 | 0 | 0 |
| 22.12.2023 00:00 - 01:00 | 0 | 0 | 0 | 0 |
| 22.12.2023 01:00 - 02:00 | 0 | 0 | 0 | 0 |
| 22.12.2023 02:00 - 03:00 | 0 | 0 | 0 | 0 |
| 22.12.2023 03:00 - 04:00 | 0 | 0 | 0 | 0 |
| 22.12.2023 04:00 - 05:00 | 0 | 0 | 0 | 0 |
| 22.12.2023 05:00 - 06:00 | 0 | 0 | 0 | 0 |
| 22.12.2023 06:00 - 07:00 | 0 | 0 | 0 | 0 |
| 22.12.2023 07:00 - 08:00 | 0 | 0 | 0 | 0 |
| 22.12.2023 08:00 - 09:00 | 0 | 0 | 0 | 0 |
| 22.12.2023 09:00 - 10:00 | 0 | 0 | 0 | 0 |
| 22.12.2023 10:00 - 11:00 | 0 | 0 | 0 | 0 |
| 22.12.2023 11:00 - 12:00 | 0 | 0 | 0 | 0 |
| 22.12.2023 12:00 - 13:00 | 0 | 0 | 0 | 0 |
| 22.12.2023 13:00 - 14:00 | 0 | 0 | 0 | 0 |
| 22.12.2023 14:00 - 15:00 | 0 | 0 | 0 | 0 |
| 22.12.2023 15:00 - 16:00 | 0 | 0 | 0 | 0 |
| 22.12.2023 16:00 - 17:00 | 0 | 0 | 0 | 0 |
| 22.12.2023 17:00 - 18:00 | 0 | 0 | 0 | 0 |
| 22.12.2023 18:00 - 19:00 | 0 | 0 | 0 | 0 |
| 22.12.2023 19:00 - 20:00 | 0 | 0 | 0 | 0 |
| 22.12.2023 20:00 - 21:00 | 0 | 0 | 0 | 0 |
| 22.12.2023 21:00 - 22:00 | 0 | 0 | 0 | 0 |
| 22.12.2023 22:00 - 23:00 | 0 | 0 | 0 | 0 |
| 22.12.2023 23:00 - 24:00 | 0 | 0 | 0 | 0 |
| 23.12.2023 00:00 - 01:00 | 0 | 0 | 0 | 0 |
| 23.12.2023 01:00 - 02:00 | 0 | 0 | 0 | 0 |
| 23.12.2023 02:00 - 03:00 | 0 | 0 | 0 | 0 |
| 23.12.2023 03:00 - 04:00 | 0 | 0 | 0 | 0 |
| 23.12.2023 04:00 - 05:00 | 0 | 0 | 0 | 0 |
| 23.12.2023 05:00 - 06:00 | 0 | 0 | 0 | 0 |
| 23.12.2023 06:00 - 07:00 | 0 | 0 | 0 | 0 |
| 23.12.2023 07:00 - 08:00 | 0 | 0 | 0 | 0 |
| 23.12.2023 08:00 - 09:00 | 0 | 0 | 0 | 0 |
| 23.12.2023 09:00 - 10:00 | 0 | 0 | 0 | 0 |
| 23.12.2023 10:00 - 11:00 | 0 | 0 | 0 | 0 |
| 23.12.2023 11:00 - 12:00 | 0 | 0 | 0 | 0 |
| 23.12.2023 12:00 - 13:00 | 0 | 0 | 0 | 0 |
| 23.12.2023 13:00 - 14:00 | 0 | 0 | 0 | 0 |
| 23.12.2023 14:00 - 15:00 | 0 | 0 | 0 | 0 |
| 23.12.2023 15:00 - 16:00 | 0 | 0 | 0 | 0 |
| 23.12.2023 16:00 - 17:00 | 0 | 0 | 0 | 0 |
| 23.12.2023 17:00 - 18:00 | 0 | 0 | 0 | 0 |
| 23.12.2023 18:00 - 19:00 | 0 | 0 | 0 | 0 |
| 23.12.2023 19:00 - 20:00 | 0 | 0 | 0 | 0 |
| 23.12.2023 20:00 - 21:00 | 0 | 0 | 0 | 0 |
| 23.12.2023 21:00 - 22:00 | 0 | 0 | 0 | 0 |
| 23.12.2023 22:00 - 23:00 | 0 | 0 | 0 | 0 |
| 23.12.2023 23:00 - 24:00 | 0 | 0 | 0 | 0 |
| 24.12.2023 00:00 - 01:00 | 0 | 0 | 0 | 0 |
| 24.12.2023 01:00 - 02:00 | 0 | 0 | 0 | 0 |
| 24.12.2023 02:00 - 03:00 | 0 | 0 | 0 | 0 |
| 24.12.2023 03:00 - 04:00 | 0 | 0 | 0 | 0 |
| 24.12.2023 04:00 - 05:00 | 0 | 0 | 0 | 0 |
| 24.12.2023 05:00 - 06:00 | 0 | 0 | 0 | 0 |
| 24.12.2023 06:00 - 07:00 | 0 | 0 | 0 | 0 |
| 24.12.2023 07:00 - 08:00 | 0 | 0 | 0 | 0 |
| 24.12.2023 08:00 - 09:00 | 0 | 0 | 0 | 0 |
| 24.12.2023 09:00 - 10:00 | 0 | 0 | 0 | 0 |
| 24.12.2023 10:00 - 11:00 | 0 | 0 | 0 | 0 |
| 24.12.2023 11:00 - 12:00 | 0 | 0 | 0 | 0 |
| 24.12.2023 12:00 - 13:00 | 0 | 0 | 0 | 0 |
| 24.12.2023 13:00 - 14:00 | 0 | 0 | 0 | 0 |
| 24.12.2023 14:00 - 15:00 | 0 | 0 | 0 | 0 |
| 24.12.2023 15:00 - 16:00 | 0 | 0 | 0 | 0 |
| 24.12.2023 16:00 - 17:00 | 0 | 0 | 0 | 0 |
| 24.12.2023 17:00 - 18:00 | 0 | 0 | 0 | 0 |
| 24.12.2023 18:00 - 19:00 | 0 | 0 | 0 | 0 |
| 24.12.2023 19:00 - 20:00 | 0 | 0 | 0 | 0 |
| 24.12.2023 20:00 - 21:00 | 0 | 0 | 0 | 0 |
| 24.12.2023 21:00 - 22:00 | 0 | 0 | 0 | 0 |
| 24.12.2023 22:00 - 23:00 | 0 | 0 | 0 | 0 |
| 24.12.2023 23:00 - 24:00 | 0 | 0 | 0 | 0 |
| 25.12.2023 00:00 - 01:00 | 0 | 0 | 0 | 0 |
| 25.12.2023 01:00 - 02:00 | 0 | -400 | 0 | 0 |
| 25.12.2023 02:00 - 03:00 | 0 | -400 | 0 | 0 |
| 25.12.2023 03:00 - 04:00 | 0 | -400 | 0 | 0 |
| 25.12.2023 04:00 - 05:00 | 0 | -400 | 0 | 0 |
| 25.12.2023 05:00 - 06:00 | 0 | -400 | 0 | 0 |
| 25.12.2023 06:00 - 07:00 | 0 | 0 | 0 | 0 |
| 25.12.2023 07:00 - 08:00 | 0 | 0 | 0 | 0 |
| 25.12.2023 08:00 - 09:00 | 0 | 0 | 0 | 0 |
| 25.12.2023 09:00 - 10:00 | 0 | 0 | 0 | 0 |
| 25.12.2023 10:00 - 11:00 | 0 | 0 | 0 | 0 |
| 25.12.2023 11:00 - 12:00 | 0 | -250 | 0 | 0 |
| 25.12.2023 12:00 - 13:00 | 0 | -250 | 0 | 0 |
| 25.12.2023 13:00 - 14:00 | 0 | -250 | 0 | 0 |
| 25.12.2023 14:00 - 15:00 | 0 | -250 | 0 | 0 |
| 25.12.2023 15:00 - 16:00 | 0 | -250 | 0 | 0 |
| 25.12.2023 16:00 - 17:00 | 0 | -250 | 0 | 0 |
| 25.12.2023 17:00 - 18:00 | 0 | -250 | 0 | 0 |
| 25.12.2023 18:00 - 19:00 | 0 | -250 | 0 | 0 |
| 25.12.2023 19:00 - 20:00 | 0 | -250 | 0 | 0 |
| 25.12.2023 20:00 - 21:00 | 0 | -250 | 0 | 0 |
| 25.12.2023 21:00 - 22:00 | 0 | -250 | 0 | 0 |
| 25.12.2023 22:00 - 23:00 | 0 | -550 | 0 | 0 |
| 25.12.2023 23:00 - 24:00 | 0 | -550 | 0 | 0 |
| 26.12.2023 00:00 - 01:00 | 0 | -550 | 0 | 0 |
| 26.12.2023 01:00 - 02:00 | 0 | -550 | 0 | 0 |
| 26.12.2023 02:00 - 03:00 | 0 | -550 | 0 | 0 |
| 26.12.2023 03:00 - 04:00 | 0 | -1150 | 0 | 0 |
| 26.12.2023 04:00 - 05:00 | 0 | -1150 | 0 | 0 |
| 26.12.2023 05:00 - 06:00 | 0 | -1150 | 0 | 0 |
| 26.12.2023 06:00 - 07:00 | 0 | 0 | 0 | 0 |
| 26.12.2023 07:00 - 08:00 | 0 | 0 | 0 | 0 |
| 26.12.2023 08:00 - 09:00 | 0 | 0 | 0 | 0 |
| 26.12.2023 09:00 - 10:00 | 0 | 0 | 0 | 0 |
| 26.12.2023 10:00 - 11:00 | 0 | -250 | 0 | 0 |
| 26.12.2023 11:00 - 12:00 | 0 | -250 | 0 | 0 |
| 26.12.2023 12:00 - 13:00 | 0 | -250 | 0 | 0 |
| 26.12.2023 13:00 - 14:00 | 0 | -250 | 0 | 0 |
| 26.12.2023 14:00 - 15:00 | 0 | -250 | 0 | 0 |
| 26.12.2023 15:00 - 16:00 | 0 | -250 | 0 | 0 |
| 26.12.2023 16:00 - 17:00 | 0 | -250 | 0 | 0 |
| 26.12.2023 17:00 - 18:00 | 0 | -250 | 0 | 0 |
| 26.12.2023 18:00 - 19:00 | 0 | -450 | 0 | 0 |
| 26.12.2023 19:00 - 20:00 | 0 | -450 | 0 | 0 |
| 26.12.2023 20:00 - 21:00 | 0 | -450 | 0 | 0 |
| 26.12.2023 21:00 - 22:00 | 0 | -450 | 0 | 0 |
| 26.12.2023 22:00 - 23:00 | 0 | -450 | 0 | 0 |
| 26.12.2023 23:00 - 24:00 | 0 | -450 | 0 | 0 |
| 27.12.2023 00:00 - 01:00 | 0 | -450 | 0 | 0 |
| 27.12.2023 01:00 - 02:00 | 0 | -450 | 0 | 0 |
| 27.12.2023 02:00 - 03:00 | 0 | -450 | 0 | 0 |
| 27.12.2023 03:00 - 04:00 | 0 | -1250 | 0 | 0 |
| 27.12.2023 04:00 - 05:00 | 0 | -1250 | 0 | 0 |
| 27.12.2023 05:00 - 06:00 | 0 | -1250 | 0 | 0 |
| 27.12.2023 06:00 - 07:00 | 0 | 0 | 0 | 0 |
| 27.12.2023 07:00 - 08:00 | 0 | 0 | 0 | 0 |
| 27.12.2023 08:00 - 09:00 | 0 | 0 | 0 | 0 |
| 27.12.2023 09:00 - 10:00 | 0 | 0 | 0 | 0 |
| 27.12.2023 10:00 - 11:00 | 0 | 0 | 0 | 0 |
| 27.12.2023 11:00 - 12:00 | 0 | 0 | 0 | 0 |
| 27.12.2023 12:00 - 13:00 | 0 | 0 | 0 | 0 |
| 27.12.2023 13:00 - 14:00 | 0 | 0 | 0 | 0 |
| 27.12.2023 14:00 - 15:00 | 0 | 0 | 0 | 0 |
| 27.12.2023 15:00 - 16:00 | 0 | 0 | 0 | 0 |
| 27.12.2023 16:00 - 17:00 | 0 | 0 | 0 | 0 |
| 27.12.2023 17:00 - 18:00 | 0 | 0 | 0 | 0 |
| 27.12.2023 18:00 - 19:00 | 0 | 0 | 0 | 0 |
| 27.12.2023 19:00 - 20:00 | 0 | 0 | 0 | 0 |
| 27.12.2023 20:00 - 21:00 | 0 | 0 | 0 | 0 |
| 27.12.2023 21:00 - 22:00 | 0 | 0 | 0 | 0 |
| 27.12.2023 22:00 - 23:00 | 0 | 0 | 0 | 0 |
| 27.12.2023 23:00 - 24:00 | 0 | 0 | 0 | 0 |
| 28.12.2023 00:00 - 01:00 | 0 | -500 | 0 | 0 |
| 28.12.2023 01:00 - 02:00 | 0 | -500 | 0 | 0 |
| 28.12.2023 02:00 - 03:00 | 0 | -1300 | 0 | 0 |
| 28.12.2023 03:00 - 04:00 | 0 | -1300 | 0 | 0 |
| 28.12.2023 04:00 - 05:00 | 0 | -1300 | 0 | 0 |
| 28.12.2023 05:00 - 06:00 | 0 | -1300 | 0 | 0 |
| 28.12.2023 06:00 - 07:00 | 0 | 0 | 0 | 0 |
| 28.12.2023 07:00 - 08:00 | 0 | 0 | 0 | 0 |
| 28.12.2023 08:00 - 09:00 | 0 | 0 | 0 | 0 |
| 28.12.2023 09:00 - 10:00 | 0 | 0 | 0 | 0 |
| 28.12.2023 10:00 - 11:00 | 0 | 0 | 0 | 0 |
| 28.12.2023 11:00 - 12:00 | 0 | 0 | 0 | 0 |
| 28.12.2023 12:00 - 13:00 | 0 | 0 | 0 | 0 |
| 28.12.2023 13:00 - 14:00 | 0 | 0 | 0 | 0 |
| 28.12.2023 14:00 - 15:00 | 0 | 0 | 0 | 0 |
| 28.12.2023 15:00 - 16:00 | 0 | 0 | 0 | 0 |
| 28.12.2023 16:00 - 17:00 | 0 | 0 | 0 | 0 |
| 28.12.2023 17:00 - 18:00 | 0 | 0 | 0 | 0 |
| 28.12.2023 18:00 - 19:00 | 0 | 0 | 0 | 0 |
| 28.12.2023 19:00 - 20:00 | 0 | 0 | 0 | 0 |
| 28.12.2023 20:00 - 21:00 | 0 | 0 | 0 | 0 |
| 28.12.2023 21:00 - 22:00 | 0 | 0 | 0 | 0 |
| 28.12.2023 22:00 - 23:00 | 0 | 0 | 0 | 0 |
| 28.12.2023 23:00 - 24:00 | 0 | 0 | 0 | 0 |
| 29.12.2023 00:00 - 01:00 | 0 | 0 | 0 | 0 |
| 29.12.2023 01:00 - 02:00 | 0 | 0 | 0 | 0 |
| 29.12.2023 02:00 - 03:00 | 0 | 0 | 0 | 0 |
| 29.12.2023 03:00 - 04:00 | 0 | 0 | 0 | 0 |
| 29.12.2023 04:00 - 05:00 | 0 | 0 | 0 | 0 |
| 29.12.2023 05:00 - 06:00 | 0 | 0 | 0 | 0 |
| 29.12.2023 06:00 - 07:00 | 0 | 0 | 0 | 0 |
| 29.12.2023 07:00 - 08:00 | 0 | 0 | 0 | 0 |
| 29.12.2023 08:00 - 09:00 | 0 | 0 | 0 | 0 |
| 29.12.2023 09:00 - 10:00 | 0 | 0 | 0 | 0 |
| 29.12.2023 10:00 - 11:00 | 0 | 0 | 0 | 0 |
| 29.12.2023 11:00 - 12:00 | 0 | 0 | 0 | 0 |
| 29.12.2023 12:00 - 13:00 | 0 | 0 | 0 | 0 |
| 29.12.2023 13:00 - 14:00 | 0 | 0 | 0 | 0 |
| 29.12.2023 14:00 - 15:00 | 0 | 0 | 0 | 0 |
| 29.12.2023 15:00 - 16:00 | 0 | 0 | 0 | 0 |
| 29.12.2023 16:00 - 17:00 | 0 | 0 | 0 | 0 |
| 29.12.2023 17:00 - 18:00 | 0 | 0 | 0 | 0 |
| 29.12.2023 18:00 - 19:00 | 0 | 0 | 0 | 0 |
| 29.12.2023 19:00 - 20:00 | 0 | 0 | 0 | 0 |
| 29.12.2023 20:00 - 21:00 | 0 | 0 | 0 | 0 |
| 29.12.2023 21:00 - 22:00 | 0 | 0 | 0 | 0 |
| 29.12.2023 22:00 - 23:00 | 0 | 0 | 0 | 0 |
| 29.12.2023 23:00 - 24:00 | 0 | 0 | 0 | 0 |
| 30.12.2023 00:00 - 01:00 | 0 | 0 | 0 | 0 |
| 30.12.2023 01:00 - 02:00 | 0 | 0 | 0 | 0 |
| 30.12.2023 02:00 - 03:00 | 0 | 0 | 0 | 0 |
| 30.12.2023 03:00 - 04:00 | 0 | 0 | 0 | 0 |
| 30.12.2023 04:00 - 05:00 | 0 | 0 | 0 | 0 |
| 30.12.2023 05:00 - 06:00 | 0 | 0 | 0 | 0 |
| 30.12.2023 06:00 - 07:00 | 0 | 0 | 0 | 0 |
| 30.12.2023 07:00 - 08:00 | 0 | 0 | 0 | 0 |
| 30.12.2023 08:00 - 09:00 | 0 | 0 | 0 | 0 |
| 30.12.2023 09:00 - 10:00 | 0 | 0 | 0 | 0 |
| 30.12.2023 10:00 - 11:00 | 0 | 0 | 0 | 0 |
| 30.12.2023 11:00 - 12:00 | 0 | 0 | 0 | 0 |
| 30.12.2023 12:00 - 13:00 | 0 | 0 | 0 | 0 |
| 30.12.2023 13:00 - 14:00 | 0 | 0 | 0 | 0 |
| 30.12.2023 14:00 - 15:00 | 0 | 0 | 0 | 0 |
| 30.12.2023 15:00 - 16:00 | 0 | 0 | 0 | 0 |
| 30.12.2023 16:00 - 17:00 | 0 | 0 | 0 | 0 |
| 30.12.2023 17:00 - 18:00 | 0 | 0 | 0 | 0 |
| 30.12.2023 18:00 - 19:00 | 0 | 0 | 0 | 0 |
| 30.12.2023 19:00 - 20:00 | 0 | 0 | 0 | 0 |
| 30.12.2023 20:00 - 21:00 | 0 | -300 | 0 | 0 |
| 30.12.2023 21:00 - 22:00 | 0 | -300 | 0 | 0 |
| 30.12.2023 22:00 - 23:00 | 0 | -300 | 0 | 0 |
| 30.12.2023 23:00 - 24:00 | 0 | -300 | 0 | 0 |
| 31.12.2023 00:00 - 01:00 | 0 | -300 | 0 | 0 |
| 31.12.2023 01:00 - 02:00 | 0 | -300 | 0 | 0 |
| 31.12.2023 02:00 - 03:00 | 0 | -300 | 0 | 0 |
| 31.12.2023 03:00 - 04:00 | 0 | -300 | 0 | 0 |
| 31.12.2023 04:00 - 05:00 | 0 | -300 | 0 | 0 |
| 31.12.2023 05:00 - 06:00 | 0 | -300 | 0 | 0 |